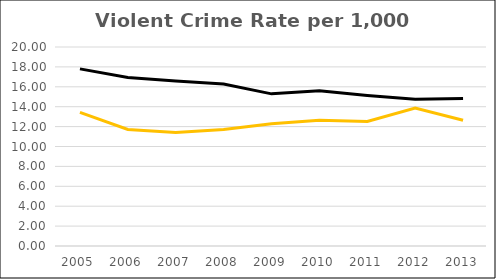
| Category | Violent Crime Rate per 1,000 Residents |
|---|---|
| 2005.0 | 17.8 |
| 2006.0 | 16.939 |
| 2007.0 | 16.581 |
| 2008.0 | 16.271 |
| 2009.0 | 15.291 |
| 2010.0 | 15.608 |
| 2011.0 | 15.133 |
| 2012.0 | 14.746 |
| 2013.0 | 14.829 |